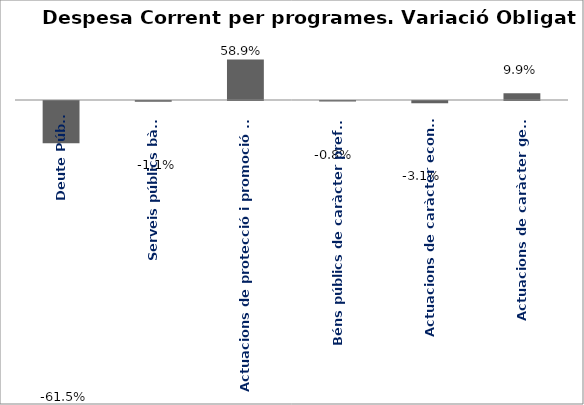
| Category | Series 0 |
|---|---|
| Deute Públic | -0.615 |
| Serveis públics bàsics | -0.011 |
| Actuacions de protecció i promoció social | 0.589 |
| Béns públics de caràcter preferent | -0.008 |
| Actuacions de caràcter econòmic | -0.031 |
| Actuacions de caràcter general | 0.099 |